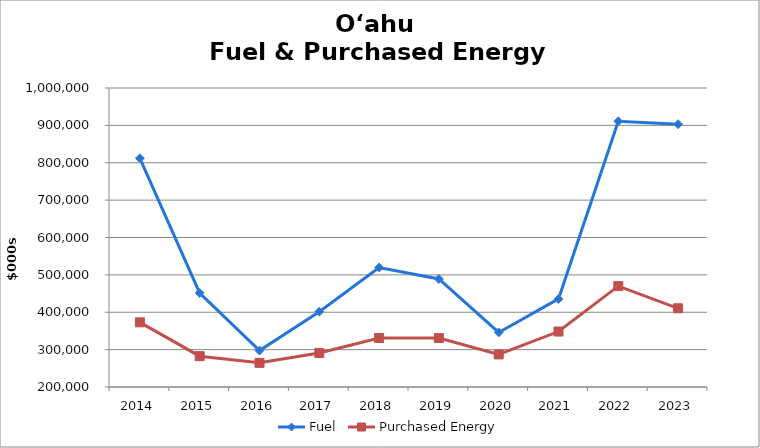
| Category | Fuel | Purchased Energy |
|---|---|---|
| 2014.0 | 811978.3 | 372994.3 |
| 2015.0 | 451476.3 | 282480.9 |
| 2016.0 | 297642.9 | 264672.4 |
| 2017.0 | 401508.8 | 291131.7 |
| 2018.0 | 519643.9 | 331082 |
| 2019.0 | 488992 | 330879.2 |
| 2020.0 | 345966.4 | 287188.4 |
| 2021.0 | 435643.254 | 348382.083 |
| 2022.0 | 911010.945 | 469950.556 |
| 2023.0 | 903075.743 | 410612.793 |